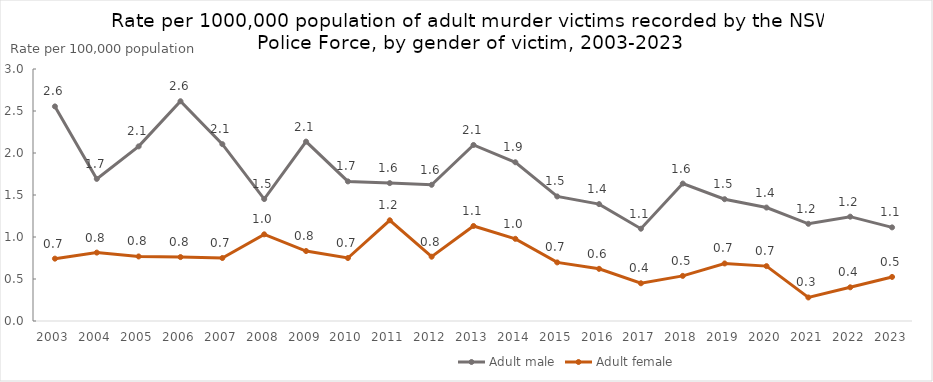
| Category | Adult male | Adult female |
|---|---|---|
| 2003.0 | 2.555 | 0.742 |
| 2004.0 | 1.692 | 0.814 |
| 2005.0 | 2.079 | 0.768 |
| 2006.0 | 2.616 | 0.761 |
| 2007.0 | 2.105 | 0.75 |
| 2008.0 | 1.452 | 1.032 |
| 2009.0 | 2.136 | 0.833 |
| 2010.0 | 1.662 | 0.75 |
| 2011.0 | 1.642 | 1.199 |
| 2012.0 | 1.622 | 0.766 |
| 2013.0 | 2.095 | 1.131 |
| 2014.0 | 1.89 | 0.978 |
| 2015.0 | 1.483 | 0.698 |
| 2016.0 | 1.392 | 0.621 |
| 2017.0 | 1.099 | 0.449 |
| 2018.0 | 1.636 | 0.537 |
| 2019.0 | 1.45 | 0.685 |
| 2020.0 | 1.35 | 0.653 |
| 2021.0 | 1.157 | 0.28 |
| 2022.0 | 1.242 | 0.401 |
| 2023.0 | 1.115 | 0.525 |